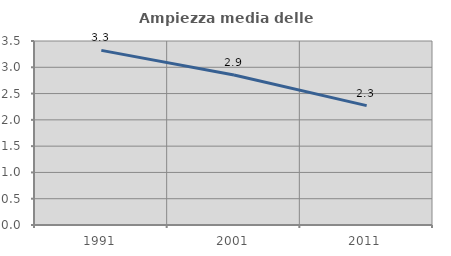
| Category | Ampiezza media delle famiglie |
|---|---|
| 1991.0 | 3.322 |
| 2001.0 | 2.852 |
| 2011.0 | 2.271 |